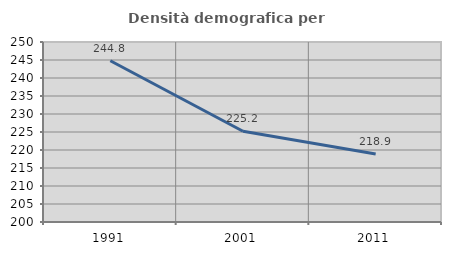
| Category | Densità demografica |
|---|---|
| 1991.0 | 244.78 |
| 2001.0 | 225.205 |
| 2011.0 | 218.902 |